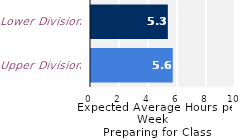
| Category | Series 0 |
|---|---|
| Upper Division | 5.64 |
| Lower Division | 5.3 |